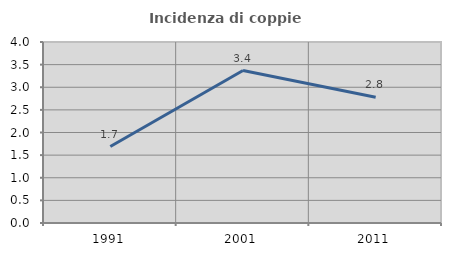
| Category | Incidenza di coppie miste |
|---|---|
| 1991.0 | 1.69 |
| 2001.0 | 3.369 |
| 2011.0 | 2.778 |